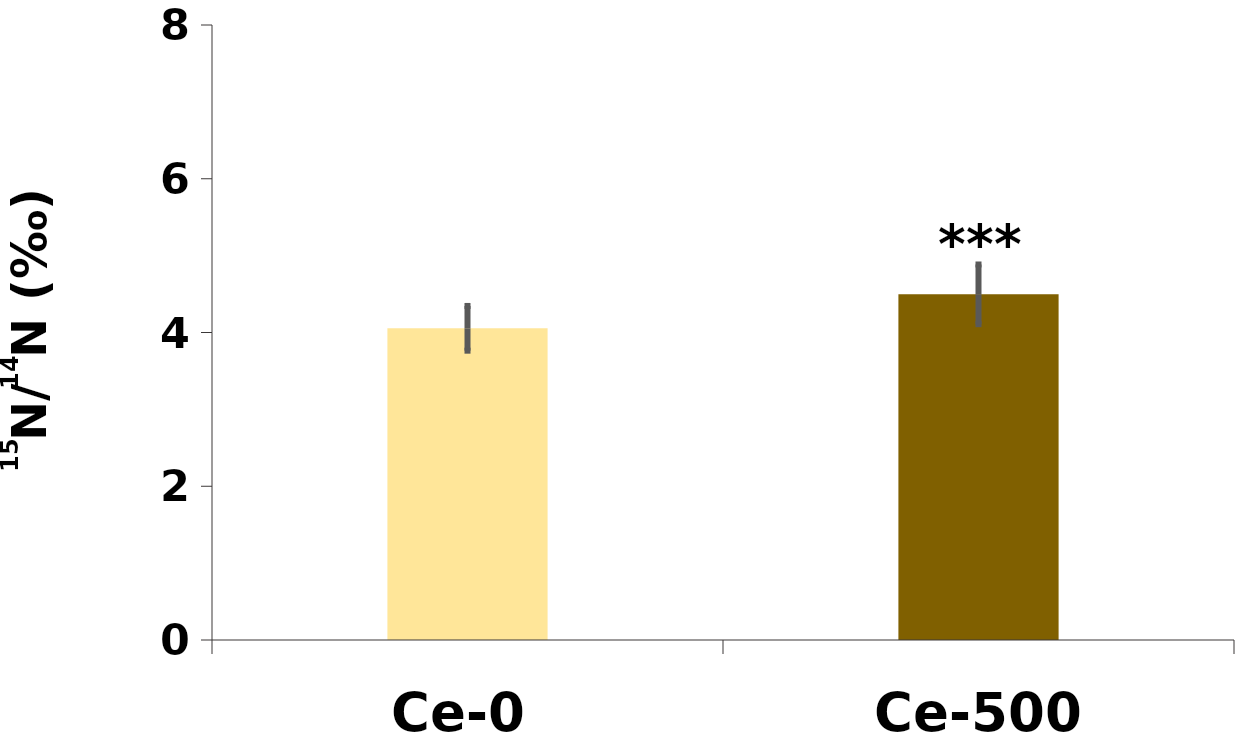
| Category | δ15N |
|---|---|
| Ce-0 | 4.054 |
| Ce-500 | 4.497 |